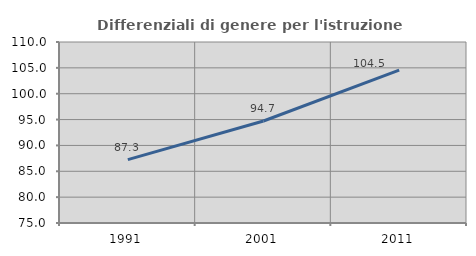
| Category | Differenziali di genere per l'istruzione superiore |
|---|---|
| 1991.0 | 87.262 |
| 2001.0 | 94.721 |
| 2011.0 | 104.547 |